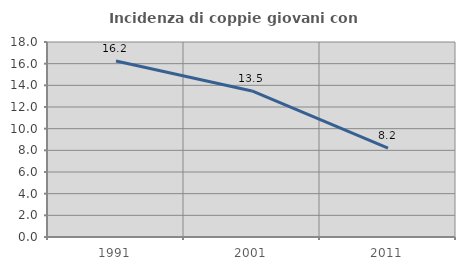
| Category | Incidenza di coppie giovani con figli |
|---|---|
| 1991.0 | 16.242 |
| 2001.0 | 13.48 |
| 2011.0 | 8.206 |